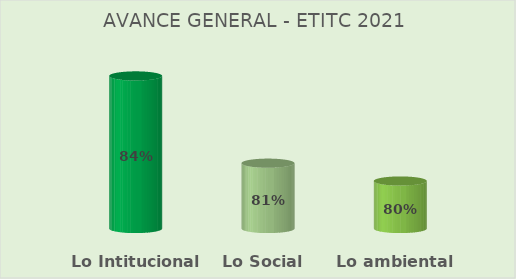
| Category | AVANCE GENERAL  |
|---|---|
| Lo Intitucional  | 0.842 |
| Lo Social  | 0.807 |
| Lo ambiental  | 0.799 |